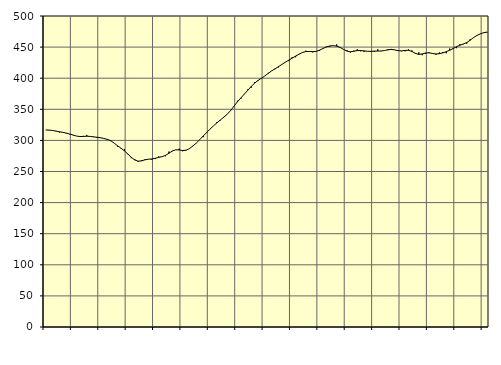
| Category | Piggar | Series 1 |
|---|---|---|
| nan | 316.8 | 316.72 |
| 87.0 | 316.8 | 316.53 |
| 87.0 | 316.2 | 315.98 |
| 87.0 | 314.6 | 314.95 |
| nan | 312.8 | 313.84 |
| 88.0 | 313.3 | 312.93 |
| 88.0 | 311.3 | 311.8 |
| 88.0 | 309.8 | 310.27 |
| nan | 308.3 | 308.58 |
| 89.0 | 307 | 306.98 |
| 89.0 | 306.1 | 306.17 |
| 89.0 | 307.3 | 306.36 |
| nan | 308.8 | 306.72 |
| 90.0 | 306.2 | 306.39 |
| 90.0 | 306.2 | 305.62 |
| 90.0 | 304.2 | 305.03 |
| nan | 303.8 | 304.3 |
| 91.0 | 303.2 | 303.17 |
| 91.0 | 300.7 | 301.68 |
| 91.0 | 299 | 299.39 |
| nan | 295.6 | 295.65 |
| 92.0 | 289.9 | 291.29 |
| 92.0 | 286.9 | 287.36 |
| 92.0 | 285.6 | 283.18 |
| nan | 277.7 | 278.16 |
| 93.0 | 271.5 | 272.77 |
| 93.0 | 270 | 268.54 |
| 93.0 | 265.5 | 266.58 |
| nan | 268.1 | 267.08 |
| 94.0 | 269.5 | 268.77 |
| 94.0 | 269.6 | 269.73 |
| 94.0 | 268.9 | 270.16 |
| nan | 270 | 271.27 |
| 95.0 | 274.3 | 272.68 |
| 95.0 | 273.8 | 273.87 |
| 95.0 | 274.6 | 275.93 |
| nan | 282 | 279.39 |
| 96.0 | 282.6 | 283.01 |
| 96.0 | 284.8 | 284.93 |
| 96.0 | 286.6 | 284.69 |
| nan | 282.5 | 283.81 |
| 97.0 | 283.7 | 284.23 |
| 97.0 | 286.5 | 286.82 |
| 97.0 | 291.2 | 290.93 |
| nan | 295.5 | 295.74 |
| 98.0 | 301.3 | 301.21 |
| 98.0 | 305.2 | 307.01 |
| 98.0 | 313 | 312.55 |
| nan | 318.2 | 318.17 |
| 99.0 | 323.2 | 323.27 |
| 99.0 | 329.6 | 328.18 |
| 99.0 | 332.1 | 332.84 |
| nan | 337.7 | 337.21 |
| 0.0 | 341.6 | 341.88 |
| 0.0 | 347.3 | 347.82 |
| 0.0 | 354.3 | 354.96 |
| nan | 363.7 | 361.92 |
| 1.0 | 366.6 | 368.26 |
| 1.0 | 374.7 | 374.25 |
| 1.0 | 381.8 | 380.38 |
| nan | 384.4 | 386.51 |
| 2.0 | 393.8 | 391.87 |
| 2.0 | 395.3 | 396.23 |
| 2.0 | 400.2 | 399.83 |
| nan | 403.6 | 403.53 |
| 3.0 | 408.6 | 407.81 |
| 3.0 | 412 | 411.72 |
| 3.0 | 414.5 | 415.12 |
| nan | 417.4 | 418.61 |
| 4.0 | 422.1 | 422.15 |
| 4.0 | 426.1 | 425.73 |
| 4.0 | 427.5 | 429 |
| nan | 433.8 | 432.35 |
| 5.0 | 433.7 | 435.51 |
| 5.0 | 439.1 | 438.56 |
| 5.0 | 441.9 | 441.36 |
| nan | 444.2 | 442.88 |
| 6.0 | 442.5 | 442.99 |
| 6.0 | 441.5 | 442.63 |
| 6.0 | 443.4 | 443.09 |
| nan | 443.7 | 445.03 |
| 7.0 | 448.2 | 447.77 |
| 7.0 | 450.9 | 450.28 |
| 7.0 | 450.7 | 451.83 |
| nan | 452.6 | 452.34 |
| 8.0 | 454.3 | 451.61 |
| 8.0 | 449.3 | 449.44 |
| 8.0 | 446.1 | 446.32 |
| nan | 445 | 443.59 |
| 9.0 | 441.3 | 442.43 |
| 9.0 | 444.3 | 443.25 |
| 9.0 | 446.4 | 444.39 |
| nan | 443.2 | 444.52 |
| 10.0 | 442.3 | 443.89 |
| 10.0 | 443.4 | 443.25 |
| 10.0 | 442.5 | 443.18 |
| nan | 442.1 | 443.52 |
| 11.0 | 446.4 | 443.63 |
| 11.0 | 443.4 | 443.76 |
| 11.0 | 444.4 | 444.53 |
| nan | 445 | 445.8 |
| 12.0 | 445.3 | 446.33 |
| 12.0 | 445.3 | 445.44 |
| 12.0 | 444 | 444.23 |
| nan | 443.4 | 443.92 |
| 13.0 | 443.2 | 444.71 |
| 13.0 | 446.3 | 444.89 |
| 13.0 | 444.6 | 442.98 |
| nan | 439.1 | 439.93 |
| 14.0 | 441.5 | 438.25 |
| 14.0 | 437 | 439.02 |
| 14.0 | 439.4 | 440.55 |
| nan | 441.8 | 440.81 |
| 15.0 | 439.3 | 439.68 |
| 15.0 | 437.6 | 438.94 |
| 15.0 | 441.4 | 439.42 |
| nan | 442.1 | 440.67 |
| 16.0 | 440.1 | 442.59 |
| 16.0 | 447.6 | 444.88 |
| 16.0 | 446.8 | 447.61 |
| nan | 448.3 | 450.59 |
| 17.0 | 454.7 | 453.06 |
| 17.0 | 454.6 | 455.02 |
| 17.0 | 455.6 | 457.33 |
| nan | 462.6 | 461.05 |
| 18.0 | 465.6 | 465.38 |
| 18.0 | 468.6 | 468.85 |
| 18.0 | 471.2 | 471.43 |
| nan | 472.8 | 473.19 |
| 19.0 | 473.7 | 474.26 |